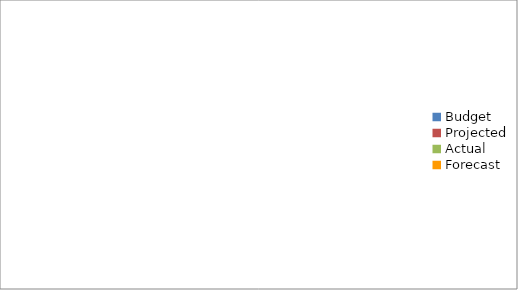
| Category | Series 0 |
|---|---|
| Budget | 1940 |
| Projected | 910 |
| Actual | 1970 |
| Forecast | 870 |